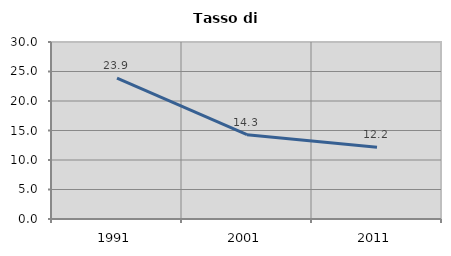
| Category | Tasso di disoccupazione   |
|---|---|
| 1991.0 | 23.886 |
| 2001.0 | 14.286 |
| 2011.0 | 12.18 |